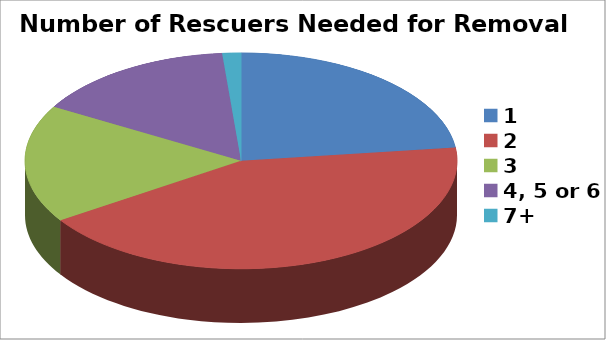
| Category | Series 0 |
|---|---|
| 1 | 264 |
| 2 | 490 |
| 3 | 202 |
| 4, 5 or 6 | 175 |
| 7+ | 16 |